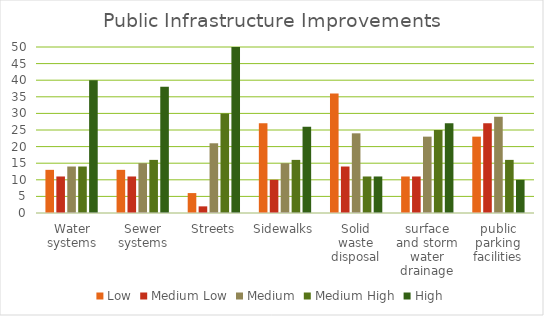
| Category | Low | Medium Low | Medium | Medium High | High |
|---|---|---|---|---|---|
| Water systems | 13 | 11 | 14 | 14 | 40 |
| Sewer systems | 13 | 11 | 15 | 16 | 38 |
| Streets | 6 | 2 | 21 | 30 | 50 |
| Sidewalks | 27 | 10 | 15 | 16 | 26 |
| Solid waste disposal | 36 | 14 | 24 | 11 | 11 |
| surface and storm water drainage | 11 | 11 | 23 | 25 | 27 |
| public parking facilities | 23 | 27 | 29 | 16 | 10 |